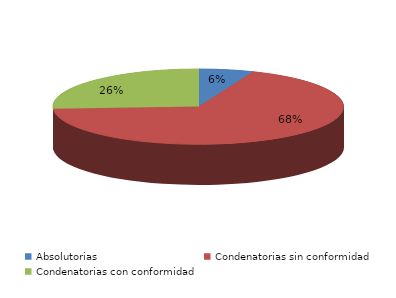
| Category | Series 0 |
|---|---|
| Absolutorias | 20 |
| Condenatorias sin conformidad | 223 |
| Condenatorias con conformidad | 85 |